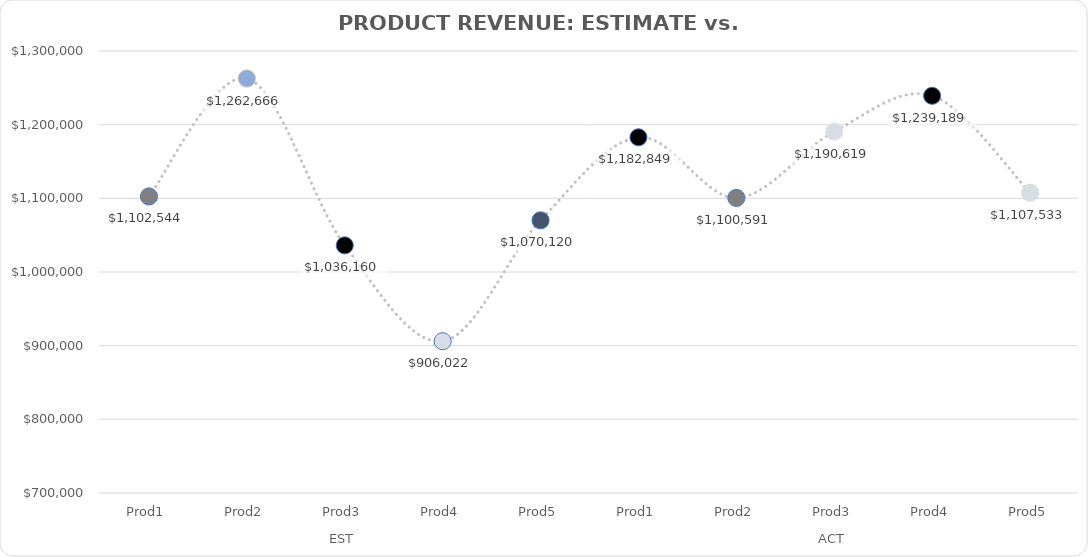
| Category | 2024 |
|---|---|
| 0 | 1102544 |
| 1 | 1262666 |
| 2 | 1036160 |
| 3 | 906022 |
| 4 | 1070120 |
| 5 | 1182849 |
| 6 | 1100591 |
| 7 | 1190619 |
| 8 | 1239189 |
| 9 | 1107533 |